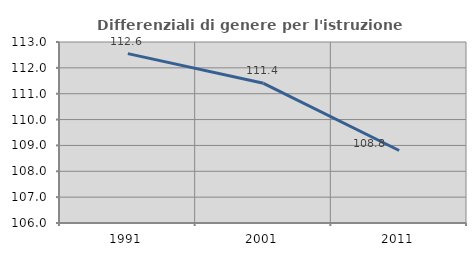
| Category | Differenziali di genere per l'istruzione superiore |
|---|---|
| 1991.0 | 112.55 |
| 2001.0 | 111.402 |
| 2011.0 | 108.805 |